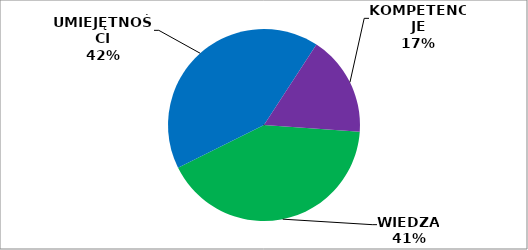
| Category | Series 0 |
|---|---|
| WIEDZA | 199 |
| UMIEJĘTNOŚCI | 199 |
| KOMPETENCJE | 81 |